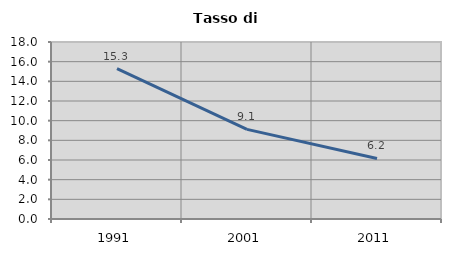
| Category | Tasso di disoccupazione   |
|---|---|
| 1991.0 | 15.297 |
| 2001.0 | 9.116 |
| 2011.0 | 6.158 |